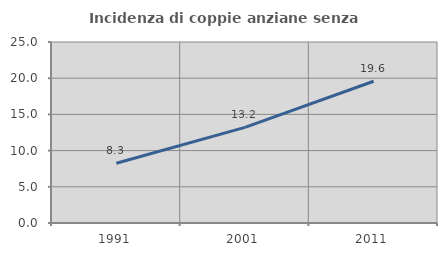
| Category | Incidenza di coppie anziane senza figli  |
|---|---|
| 1991.0 | 8.253 |
| 2001.0 | 13.213 |
| 2011.0 | 19.579 |